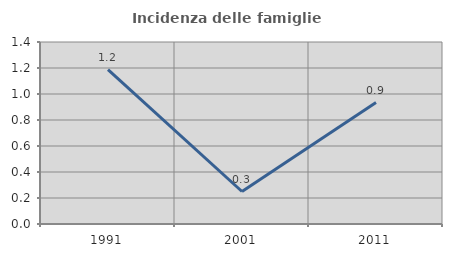
| Category | Incidenza delle famiglie numerose |
|---|---|
| 1991.0 | 1.187 |
| 2001.0 | 0.25 |
| 2011.0 | 0.935 |